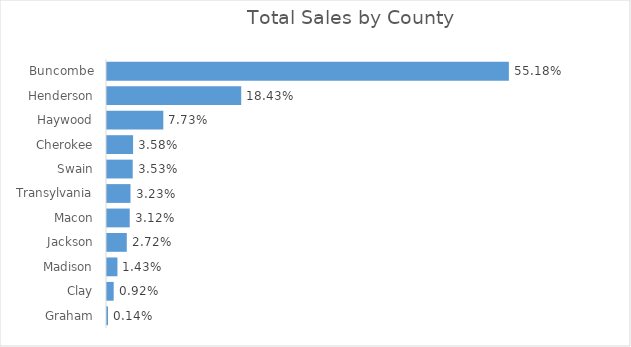
| Category | Total |
|---|---|
| Buncombe | 0.552 |
| Henderson | 0.184 |
| Haywood | 0.077 |
| Cherokee | 0.036 |
| Swain | 0.035 |
| Transylvania | 0.032 |
| Macon | 0.031 |
| Jackson | 0.027 |
| Madison | 0.014 |
| Clay | 0.009 |
| Graham | 0.001 |